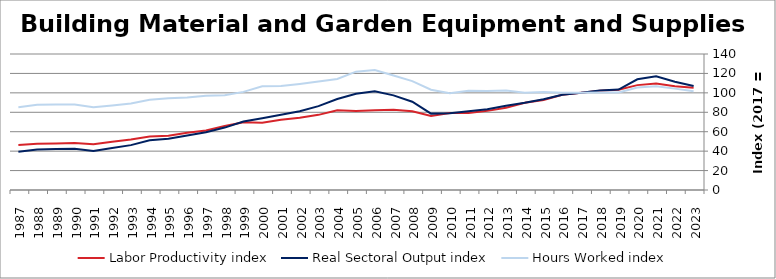
| Category | Labor Productivity index | Real Sectoral Output index | Hours Worked index |
|---|---|---|---|
| 2023.0 | 105.332 | 107.071 | 101.651 |
| 2022.0 | 106.802 | 111.456 | 104.357 |
| 2021.0 | 109.585 | 117.007 | 106.773 |
| 2020.0 | 107.97 | 113.963 | 105.551 |
| 2019.0 | 103.141 | 103.431 | 100.281 |
| 2018.0 | 102.167 | 102.459 | 100.286 |
| 2017.0 | 100 | 100 | 100 |
| 2016.0 | 98.128 | 98.148 | 100.02 |
| 2015.0 | 92.692 | 93.505 | 100.877 |
| 2014.0 | 89.719 | 89.716 | 99.996 |
| 2013.0 | 84.685 | 86.742 | 102.429 |
| 2012.0 | 81.459 | 83.061 | 101.967 |
| 2011.0 | 79.332 | 80.981 | 102.078 |
| 2010.0 | 79.379 | 79.117 | 99.67 |
| 2009.0 | 76.16 | 78.624 | 103.236 |
| 2008.0 | 81.086 | 90.92 | 112.128 |
| 2007.0 | 82.622 | 97.442 | 117.937 |
| 2006.0 | 82.21 | 101.535 | 123.508 |
| 2005.0 | 81.359 | 99.121 | 121.831 |
| 2004.0 | 82.025 | 93.713 | 114.25 |
| 2003.0 | 77.353 | 86.339 | 111.618 |
| 2002.0 | 74.285 | 81.082 | 109.149 |
| 2001.0 | 72.307 | 77.41 | 107.057 |
| 2000.0 | 69.154 | 73.859 | 106.804 |
| 1999.0 | 69.827 | 70.533 | 101.011 |
| 1998.0 | 65.807 | 64.25 | 97.635 |
| 1997.0 | 61.217 | 59.439 | 97.096 |
| 1996.0 | 58.878 | 56.019 | 95.144 |
| 1995.0 | 55.809 | 52.678 | 94.389 |
| 1994.0 | 55.04 | 51.102 | 92.846 |
| 1993.0 | 51.872 | 46.2 | 89.065 |
| 1992.0 | 49.766 | 43.329 | 87.065 |
| 1991.0 | 47.179 | 40.228 | 85.266 |
| 1990.0 | 48.379 | 42.568 | 87.989 |
| 1989.0 | 47.872 | 42.099 | 87.942 |
| 1988.0 | 47.566 | 41.684 | 87.635 |
| 1987.0 | 46.237 | 39.405 | 85.225 |